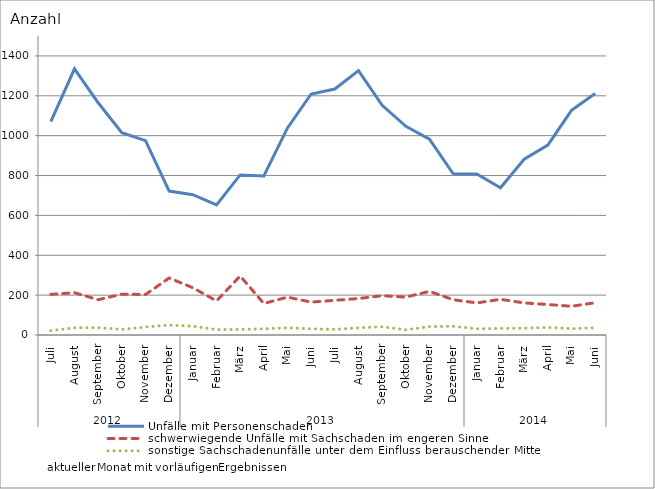
| Category | Unfälle mit Personenschaden | schwerwiegende Unfälle mit Sachschaden im engeren Sinne | sonstige Sachschadenunfälle unter dem Einfluss berauschender Mittel |
|---|---|---|---|
| 0 | 1070 | 204 | 22 |
| 1 | 1335 | 212 | 36 |
| 2 | 1165 | 177 | 37 |
| 3 | 1015 | 205 | 28 |
| 4 | 975 | 203 | 40 |
| 5 | 722 | 286 | 50 |
| 6 | 704 | 237 | 44 |
| 7 | 653 | 171 | 27 |
| 8 | 803 | 296 | 28 |
| 9 | 798 | 158 | 31 |
| 10 | 1039 | 190 | 36 |
| 11 | 1209 | 165 | 31 |
| 12 | 1234 | 174 | 28 |
| 13 | 1326 | 183 | 36 |
| 14 | 1152 | 197 | 41 |
| 15 | 1047 | 190 | 26 |
| 16 | 983 | 219 | 42 |
| 17 | 809 | 177 | 44 |
| 18 | 808 | 161 | 31 |
| 19 | 739 | 179 | 33 |
| 20 | 882 | 161 | 34 |
| 21 | 953 | 153 | 38 |
| 22 | 1127 | 144 | 32 |
| 23 | 1212 | 162 | 36 |